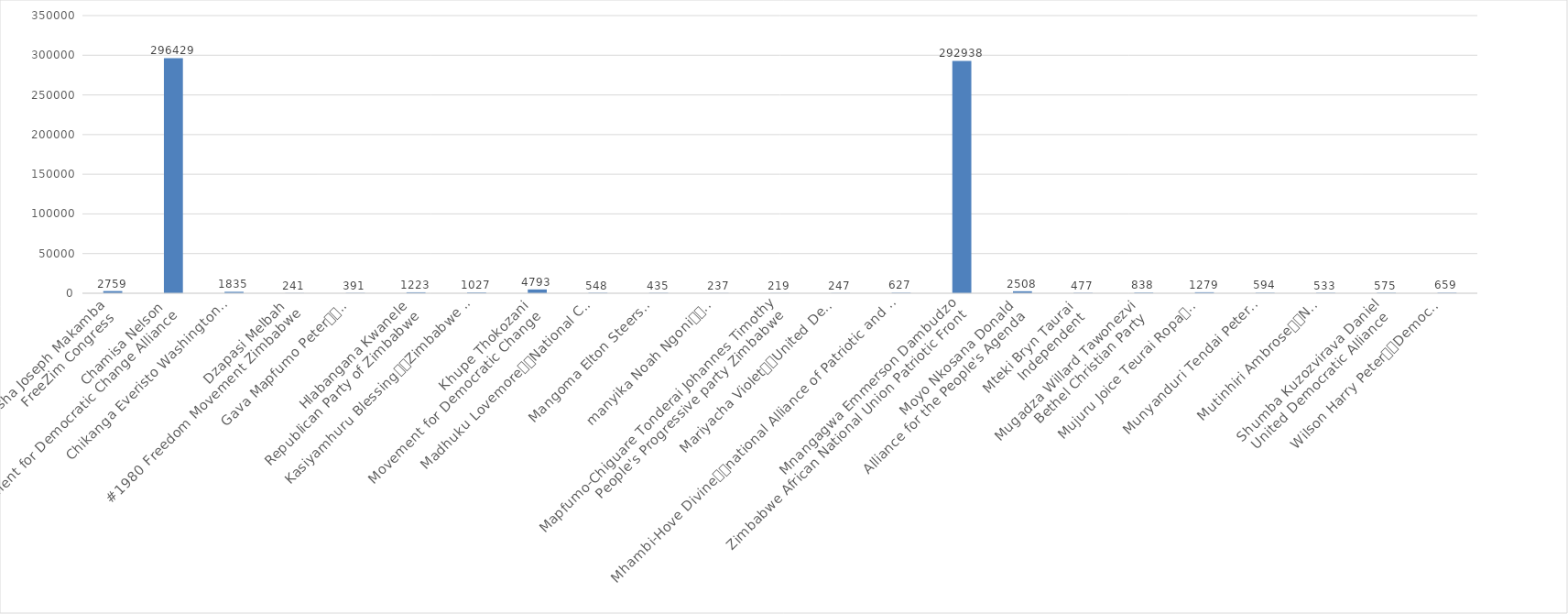
| Category | Series 0 |
|---|---|
| Busha Joseph Makamba
FreeZim Congress | 2759 |
| Chamisa Nelson
Movement for Democratic Change Alliance | 296429 |
| Chikanga Everisto Washington
Rebuild Zimbabwe | 1835 |
| Dzapasi Melbah
#1980 Freedom Movement Zimbabwe | 241 |
| Gava Mapfumo Peter
United Democratic Front | 391 |
| Hlabangana Kwanele
Republican Party of Zimbabwe | 1223 |
| Kasiyamhuru Blessing
Zimbabwe Partnership for Prosperity | 1027 |
| Khupe Thokozani
Movement for Democratic Change | 4793 |
| Madhuku Lovemore
National Constitutional Assembly | 548 |
| Mangoma Elton Steers
Coalition of Democrats | 435 |
| manyika Noah Ngoni
Build Zimbabwe Alliance | 237 |
| Mapfumo-Chiguare Tonderai Johannes Timothy
People's Progressive party Zimbabwe | 219 |
| Mariyacha Violet
United Democracy Movement | 247 |
| Mhambi-Hove Divine
national Alliance of Patriotic and Democratic Republicans | 627 |
| Mnangagwa Emmerson Dambudzo
Zimbabwe African National Union Patriotic Front | 292938 |
| Moyo Nkosana Donald
Alliance for the People's Agenda | 2508 |
| Mteki Bryn Taurai
Independent | 477 |
| Mugadza Willard Tawonezvi
Bethel Christian Party | 838 |
| Mujuru Joice Teurai Ropa
People's Rainbow Coalition | 1279 |
| Munyanduri Tendai Peter
New Patriotic Front | 594 |
| Mutinhiri Ambrose
National Patriotic Front | 533 |
| Shumba Kuzozvirava Daniel
United Democratic Alliance | 575 |
| Wilson Harry Peter
Democratic Opposition Party | 659 |